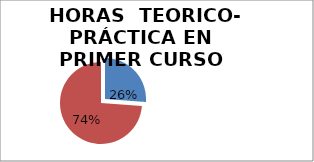
| Category | 256 722 |
|---|---|
| 0 | 256 |
| 1 | 722 |